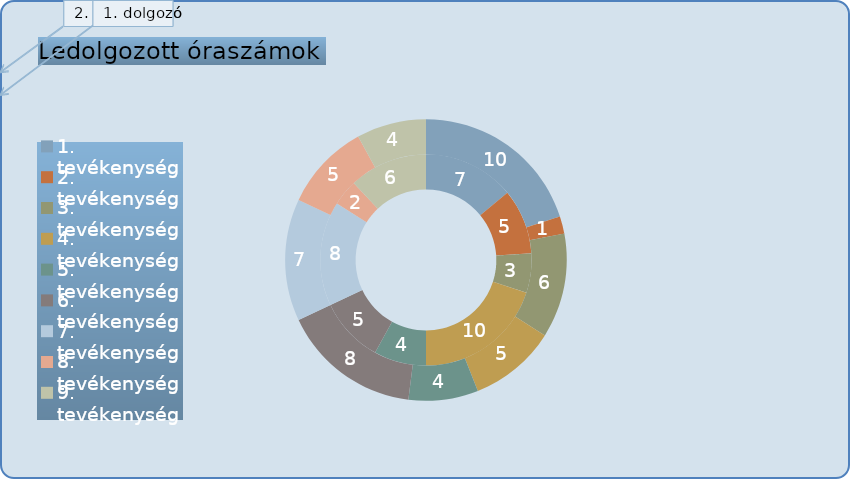
| Category | 1. dolgozó (óraszám) | 2. dolgozó (óraszám) |
|---|---|---|
| 1. tevékenység | 7 | 10 |
| 2. tevékenység | 5 | 1 |
| 3. tevékenység | 3 | 6 |
| 4. tevékenység | 10 | 5 |
| 5. tevékenység | 4 | 4 |
| 6. tevékenység | 5 | 8 |
| 7. tevékenység | 8 | 7 |
| 8. tevékenység | 2 | 5 |
| 9. tevékenység | 6 | 4 |